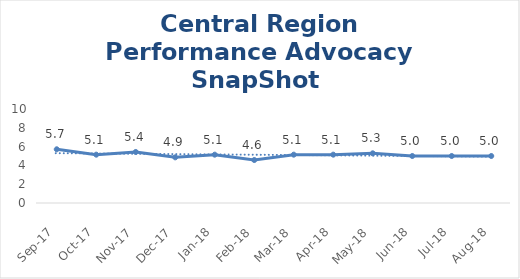
| Category | Central Region |
|---|---|
| Sep-17 | 5.714 |
| Oct-17 | 5.143 |
| Nov-17 | 5.429 |
| Dec-17 | 4.857 |
| Jan-18 | 5.143 |
| Feb-18 | 4.571 |
| Mar-18 | 5.143 |
| Apr-18 | 5.143 |
| May-18 | 5.286 |
| Jun-18 | 5 |
| Jul-18 | 5 |
| Aug-18 | 5 |